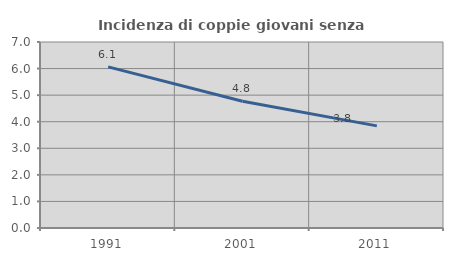
| Category | Incidenza di coppie giovani senza figli |
|---|---|
| 1991.0 | 6.065 |
| 2001.0 | 4.769 |
| 2011.0 | 3.844 |